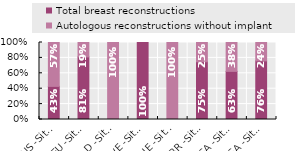
| Category | Total breast reconstructions | Autologous reconstructions without implant |
|---|---|---|
| AUS -Site/s | 0.43 | 0.57 |
| DEU -Site/s | 0.812 | 0.188 |
| NLD -Site/s | 0 | 1 |
| SWE -Site/s | 1 | 0 |
| CHE -Site/s | 0 | 1 |
| GBR -Site/s | 0.75 | 0.25 |
| USA -Site 1 | 0.625 | 0.375 |
| USA -Site 2 | 0.761 | 0.239 |